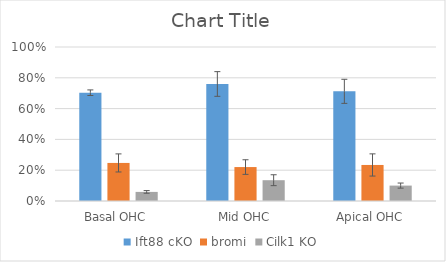
| Category | Ift88 cKO | bromi | Cilk1 KO |
|---|---|---|---|
| Basal OHC | 0.703 | 0.247 | 0.059 |
| Mid OHC | 0.76 | 0.22 | 0.135 |
| Apical OHC | 0.712 | 0.234 | 0.1 |